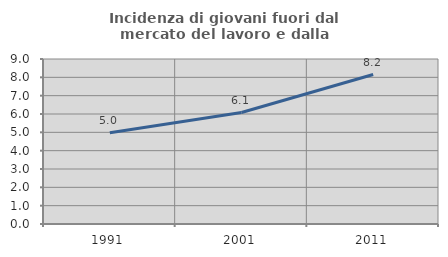
| Category | Incidenza di giovani fuori dal mercato del lavoro e dalla formazione  |
|---|---|
| 1991.0 | 4.979 |
| 2001.0 | 6.08 |
| 2011.0 | 8.154 |